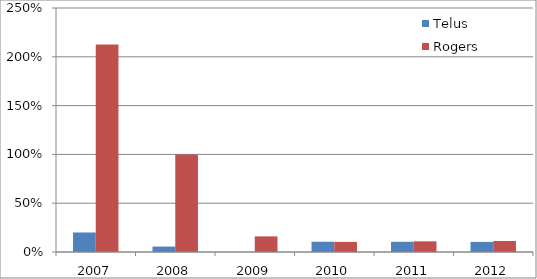
| Category | Telus | Rogers |
|---|---|---|
| 2007.0 | 0.2 | 2.125 |
| 2008.0 | 0.056 | 1 |
| 2009.0 | 0 | 0.16 |
| 2010.0 | 0.105 | 0.103 |
| 2011.0 | 0.105 | 0.109 |
| 2012.0 | 0.103 | 0.113 |